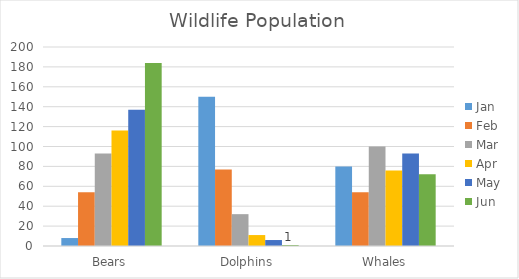
| Category | Jan | Feb | Mar | Apr | May | Jun |
|---|---|---|---|---|---|---|
| Bears | 8 | 54 | 93 | 116 | 137 | 184 |
| Dolphins | 150 | 77 | 32 | 11 | 6 | 1 |
| Whales | 80 | 54 | 100 | 76 | 93 | 72 |